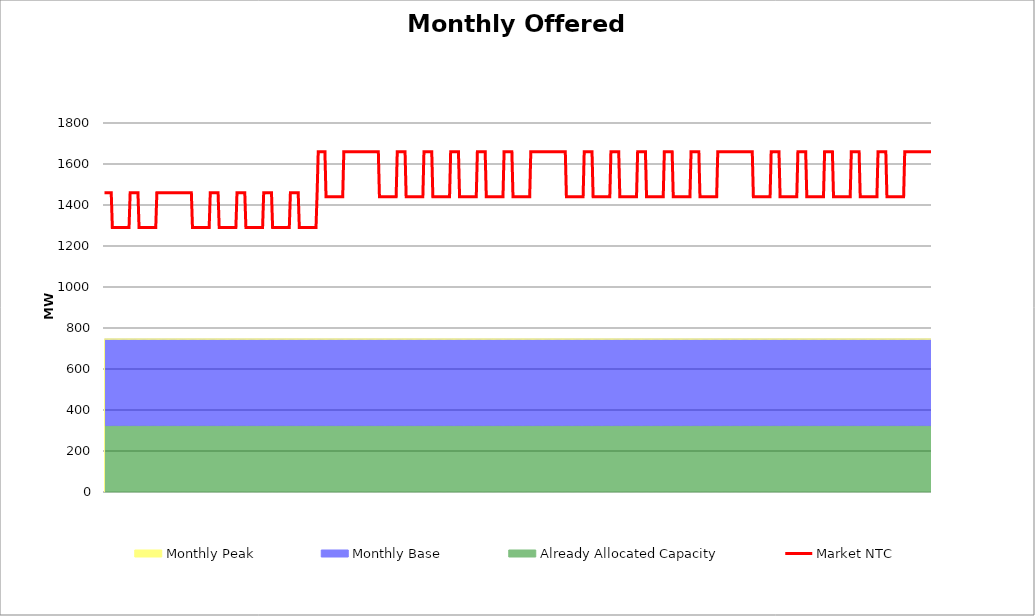
| Category | Market NTC |
|---|---|
| 0 | 1460 |
| 1 | 1460 |
| 2 | 1460 |
| 3 | 1460 |
| 4 | 1460 |
| 5 | 1460 |
| 6 | 1460 |
| 7 | 1290 |
| 8 | 1290 |
| 9 | 1290 |
| 10 | 1290 |
| 11 | 1290 |
| 12 | 1290 |
| 13 | 1290 |
| 14 | 1290 |
| 15 | 1290 |
| 16 | 1290 |
| 17 | 1290 |
| 18 | 1290 |
| 19 | 1290 |
| 20 | 1290 |
| 21 | 1290 |
| 22 | 1290 |
| 23 | 1460 |
| 24 | 1460 |
| 25 | 1460 |
| 26 | 1460 |
| 27 | 1460 |
| 28 | 1460 |
| 29 | 1460 |
| 30 | 1460 |
| 31 | 1290 |
| 32 | 1290 |
| 33 | 1290 |
| 34 | 1290 |
| 35 | 1290 |
| 36 | 1290 |
| 37 | 1290 |
| 38 | 1290 |
| 39 | 1290 |
| 40 | 1290 |
| 41 | 1290 |
| 42 | 1290 |
| 43 | 1290 |
| 44 | 1290 |
| 45 | 1290 |
| 46 | 1290 |
| 47 | 1460 |
| 48 | 1460 |
| 49 | 1460 |
| 50 | 1460 |
| 51 | 1460 |
| 52 | 1460 |
| 53 | 1460 |
| 54 | 1460 |
| 55 | 1460 |
| 56 | 1460 |
| 57 | 1460 |
| 58 | 1460 |
| 59 | 1460 |
| 60 | 1460 |
| 61 | 1460 |
| 62 | 1460 |
| 63 | 1460 |
| 64 | 1460 |
| 65 | 1460 |
| 66 | 1460 |
| 67 | 1460 |
| 68 | 1460 |
| 69 | 1460 |
| 70 | 1460 |
| 71 | 1460 |
| 72 | 1460 |
| 73 | 1460 |
| 74 | 1460 |
| 75 | 1460 |
| 76 | 1460 |
| 77 | 1460 |
| 78 | 1460 |
| 79 | 1290 |
| 80 | 1290 |
| 81 | 1290 |
| 82 | 1290 |
| 83 | 1290 |
| 84 | 1290 |
| 85 | 1290 |
| 86 | 1290 |
| 87 | 1290 |
| 88 | 1290 |
| 89 | 1290 |
| 90 | 1290 |
| 91 | 1290 |
| 92 | 1290 |
| 93 | 1290 |
| 94 | 1290 |
| 95 | 1460 |
| 96 | 1460 |
| 97 | 1460 |
| 98 | 1460 |
| 99 | 1460 |
| 100 | 1460 |
| 101 | 1460 |
| 102 | 1460 |
| 103 | 1290 |
| 104 | 1290 |
| 105 | 1290 |
| 106 | 1290 |
| 107 | 1290 |
| 108 | 1290 |
| 109 | 1290 |
| 110 | 1290 |
| 111 | 1290 |
| 112 | 1290 |
| 113 | 1290 |
| 114 | 1290 |
| 115 | 1290 |
| 116 | 1290 |
| 117 | 1290 |
| 118 | 1290 |
| 119 | 1460 |
| 120 | 1460 |
| 121 | 1460 |
| 122 | 1460 |
| 123 | 1460 |
| 124 | 1460 |
| 125 | 1460 |
| 126 | 1460 |
| 127 | 1290 |
| 128 | 1290 |
| 129 | 1290 |
| 130 | 1290 |
| 131 | 1290 |
| 132 | 1290 |
| 133 | 1290 |
| 134 | 1290 |
| 135 | 1290 |
| 136 | 1290 |
| 137 | 1290 |
| 138 | 1290 |
| 139 | 1290 |
| 140 | 1290 |
| 141 | 1290 |
| 142 | 1290 |
| 143 | 1460 |
| 144 | 1460 |
| 145 | 1460 |
| 146 | 1460 |
| 147 | 1460 |
| 148 | 1460 |
| 149 | 1460 |
| 150 | 1460 |
| 151 | 1290 |
| 152 | 1290 |
| 153 | 1290 |
| 154 | 1290 |
| 155 | 1290 |
| 156 | 1290 |
| 157 | 1290 |
| 158 | 1290 |
| 159 | 1290 |
| 160 | 1290 |
| 161 | 1290 |
| 162 | 1290 |
| 163 | 1290 |
| 164 | 1290 |
| 165 | 1290 |
| 166 | 1290 |
| 167 | 1460 |
| 168 | 1460 |
| 169 | 1460 |
| 170 | 1460 |
| 171 | 1460 |
| 172 | 1460 |
| 173 | 1460 |
| 174 | 1460 |
| 175 | 1290 |
| 176 | 1290 |
| 177 | 1290 |
| 178 | 1290 |
| 179 | 1290 |
| 180 | 1290 |
| 181 | 1290 |
| 182 | 1290 |
| 183 | 1290 |
| 184 | 1290 |
| 185 | 1290 |
| 186 | 1290 |
| 187 | 1290 |
| 188 | 1290 |
| 189 | 1290 |
| 190 | 1290 |
| 191 | 1460 |
| 192 | 1660 |
| 193 | 1660 |
| 194 | 1660 |
| 195 | 1660 |
| 196 | 1660 |
| 197 | 1660 |
| 198 | 1660 |
| 199 | 1440 |
| 200 | 1440 |
| 201 | 1440 |
| 202 | 1440 |
| 203 | 1440 |
| 204 | 1440 |
| 205 | 1440 |
| 206 | 1440 |
| 207 | 1440 |
| 208 | 1440 |
| 209 | 1440 |
| 210 | 1440 |
| 211 | 1440 |
| 212 | 1440 |
| 213 | 1440 |
| 214 | 1440 |
| 215 | 1660 |
| 216 | 1660 |
| 217 | 1660 |
| 218 | 1660 |
| 219 | 1660 |
| 220 | 1660 |
| 221 | 1660 |
| 222 | 1660 |
| 223 | 1660 |
| 224 | 1660 |
| 225 | 1660 |
| 226 | 1660 |
| 227 | 1660 |
| 228 | 1660 |
| 229 | 1660 |
| 230 | 1660 |
| 231 | 1660 |
| 232 | 1660 |
| 233 | 1660 |
| 234 | 1660 |
| 235 | 1660 |
| 236 | 1660 |
| 237 | 1660 |
| 238 | 1660 |
| 239 | 1660 |
| 240 | 1660 |
| 241 | 1660 |
| 242 | 1660 |
| 243 | 1660 |
| 244 | 1660 |
| 245 | 1660 |
| 246 | 1660 |
| 247 | 1440 |
| 248 | 1440 |
| 249 | 1440 |
| 250 | 1440 |
| 251 | 1440 |
| 252 | 1440 |
| 253 | 1440 |
| 254 | 1440 |
| 255 | 1440 |
| 256 | 1440 |
| 257 | 1440 |
| 258 | 1440 |
| 259 | 1440 |
| 260 | 1440 |
| 261 | 1440 |
| 262 | 1440 |
| 263 | 1660 |
| 264 | 1660 |
| 265 | 1660 |
| 266 | 1660 |
| 267 | 1660 |
| 268 | 1660 |
| 269 | 1660 |
| 270 | 1660 |
| 271 | 1440 |
| 272 | 1440 |
| 273 | 1440 |
| 274 | 1440 |
| 275 | 1440 |
| 276 | 1440 |
| 277 | 1440 |
| 278 | 1440 |
| 279 | 1440 |
| 280 | 1440 |
| 281 | 1440 |
| 282 | 1440 |
| 283 | 1440 |
| 284 | 1440 |
| 285 | 1440 |
| 286 | 1440 |
| 287 | 1660 |
| 288 | 1660 |
| 289 | 1660 |
| 290 | 1660 |
| 291 | 1660 |
| 292 | 1660 |
| 293 | 1660 |
| 294 | 1660 |
| 295 | 1440 |
| 296 | 1440 |
| 297 | 1440 |
| 298 | 1440 |
| 299 | 1440 |
| 300 | 1440 |
| 301 | 1440 |
| 302 | 1440 |
| 303 | 1440 |
| 304 | 1440 |
| 305 | 1440 |
| 306 | 1440 |
| 307 | 1440 |
| 308 | 1440 |
| 309 | 1440 |
| 310 | 1440 |
| 311 | 1660 |
| 312 | 1660 |
| 313 | 1660 |
| 314 | 1660 |
| 315 | 1660 |
| 316 | 1660 |
| 317 | 1660 |
| 318 | 1660 |
| 319 | 1440 |
| 320 | 1440 |
| 321 | 1440 |
| 322 | 1440 |
| 323 | 1440 |
| 324 | 1440 |
| 325 | 1440 |
| 326 | 1440 |
| 327 | 1440 |
| 328 | 1440 |
| 329 | 1440 |
| 330 | 1440 |
| 331 | 1440 |
| 332 | 1440 |
| 333 | 1440 |
| 334 | 1440 |
| 335 | 1660 |
| 336 | 1660 |
| 337 | 1660 |
| 338 | 1660 |
| 339 | 1660 |
| 340 | 1660 |
| 341 | 1660 |
| 342 | 1660 |
| 343 | 1440 |
| 344 | 1440 |
| 345 | 1440 |
| 346 | 1440 |
| 347 | 1440 |
| 348 | 1440 |
| 349 | 1440 |
| 350 | 1440 |
| 351 | 1440 |
| 352 | 1440 |
| 353 | 1440 |
| 354 | 1440 |
| 355 | 1440 |
| 356 | 1440 |
| 357 | 1440 |
| 358 | 1440 |
| 359 | 1660 |
| 360 | 1660 |
| 361 | 1660 |
| 362 | 1660 |
| 363 | 1660 |
| 364 | 1660 |
| 365 | 1660 |
| 366 | 1660 |
| 367 | 1440 |
| 368 | 1440 |
| 369 | 1440 |
| 370 | 1440 |
| 371 | 1440 |
| 372 | 1440 |
| 373 | 1440 |
| 374 | 1440 |
| 375 | 1440 |
| 376 | 1440 |
| 377 | 1440 |
| 378 | 1440 |
| 379 | 1440 |
| 380 | 1440 |
| 381 | 1440 |
| 382 | 1440 |
| 383 | 1660 |
| 384 | 1660 |
| 385 | 1660 |
| 386 | 1660 |
| 387 | 1660 |
| 388 | 1660 |
| 389 | 1660 |
| 390 | 1660 |
| 391 | 1660 |
| 392 | 1660 |
| 393 | 1660 |
| 394 | 1660 |
| 395 | 1660 |
| 396 | 1660 |
| 397 | 1660 |
| 398 | 1660 |
| 399 | 1660 |
| 400 | 1660 |
| 401 | 1660 |
| 402 | 1660 |
| 403 | 1660 |
| 404 | 1660 |
| 405 | 1660 |
| 406 | 1660 |
| 407 | 1660 |
| 408 | 1660 |
| 409 | 1660 |
| 410 | 1660 |
| 411 | 1660 |
| 412 | 1660 |
| 413 | 1660 |
| 414 | 1660 |
| 415 | 1440 |
| 416 | 1440 |
| 417 | 1440 |
| 418 | 1440 |
| 419 | 1440 |
| 420 | 1440 |
| 421 | 1440 |
| 422 | 1440 |
| 423 | 1440 |
| 424 | 1440 |
| 425 | 1440 |
| 426 | 1440 |
| 427 | 1440 |
| 428 | 1440 |
| 429 | 1440 |
| 430 | 1440 |
| 431 | 1660 |
| 432 | 1660 |
| 433 | 1660 |
| 434 | 1660 |
| 435 | 1660 |
| 436 | 1660 |
| 437 | 1660 |
| 438 | 1660 |
| 439 | 1440 |
| 440 | 1440 |
| 441 | 1440 |
| 442 | 1440 |
| 443 | 1440 |
| 444 | 1440 |
| 445 | 1440 |
| 446 | 1440 |
| 447 | 1440 |
| 448 | 1440 |
| 449 | 1440 |
| 450 | 1440 |
| 451 | 1440 |
| 452 | 1440 |
| 453 | 1440 |
| 454 | 1440 |
| 455 | 1660 |
| 456 | 1660 |
| 457 | 1660 |
| 458 | 1660 |
| 459 | 1660 |
| 460 | 1660 |
| 461 | 1660 |
| 462 | 1660 |
| 463 | 1440 |
| 464 | 1440 |
| 465 | 1440 |
| 466 | 1440 |
| 467 | 1440 |
| 468 | 1440 |
| 469 | 1440 |
| 470 | 1440 |
| 471 | 1440 |
| 472 | 1440 |
| 473 | 1440 |
| 474 | 1440 |
| 475 | 1440 |
| 476 | 1440 |
| 477 | 1440 |
| 478 | 1440 |
| 479 | 1660 |
| 480 | 1660 |
| 481 | 1660 |
| 482 | 1660 |
| 483 | 1660 |
| 484 | 1660 |
| 485 | 1660 |
| 486 | 1660 |
| 487 | 1440 |
| 488 | 1440 |
| 489 | 1440 |
| 490 | 1440 |
| 491 | 1440 |
| 492 | 1440 |
| 493 | 1440 |
| 494 | 1440 |
| 495 | 1440 |
| 496 | 1440 |
| 497 | 1440 |
| 498 | 1440 |
| 499 | 1440 |
| 500 | 1440 |
| 501 | 1440 |
| 502 | 1440 |
| 503 | 1660 |
| 504 | 1660 |
| 505 | 1660 |
| 506 | 1660 |
| 507 | 1660 |
| 508 | 1660 |
| 509 | 1660 |
| 510 | 1660 |
| 511 | 1440 |
| 512 | 1440 |
| 513 | 1440 |
| 514 | 1440 |
| 515 | 1440 |
| 516 | 1440 |
| 517 | 1440 |
| 518 | 1440 |
| 519 | 1440 |
| 520 | 1440 |
| 521 | 1440 |
| 522 | 1440 |
| 523 | 1440 |
| 524 | 1440 |
| 525 | 1440 |
| 526 | 1440 |
| 527 | 1660 |
| 528 | 1660 |
| 529 | 1660 |
| 530 | 1660 |
| 531 | 1660 |
| 532 | 1660 |
| 533 | 1660 |
| 534 | 1660 |
| 535 | 1440 |
| 536 | 1440 |
| 537 | 1440 |
| 538 | 1440 |
| 539 | 1440 |
| 540 | 1440 |
| 541 | 1440 |
| 542 | 1440 |
| 543 | 1440 |
| 544 | 1440 |
| 545 | 1440 |
| 546 | 1440 |
| 547 | 1440 |
| 548 | 1440 |
| 549 | 1440 |
| 550 | 1440 |
| 551 | 1660 |
| 552 | 1660 |
| 553 | 1660 |
| 554 | 1660 |
| 555 | 1660 |
| 556 | 1660 |
| 557 | 1660 |
| 558 | 1660 |
| 559 | 1660 |
| 560 | 1660 |
| 561 | 1660 |
| 562 | 1660 |
| 563 | 1660 |
| 564 | 1660 |
| 565 | 1660 |
| 566 | 1660 |
| 567 | 1660 |
| 568 | 1660 |
| 569 | 1660 |
| 570 | 1660 |
| 571 | 1660 |
| 572 | 1660 |
| 573 | 1660 |
| 574 | 1660 |
| 575 | 1660 |
| 576 | 1660 |
| 577 | 1660 |
| 578 | 1660 |
| 579 | 1660 |
| 580 | 1660 |
| 581 | 1660 |
| 582 | 1660 |
| 583 | 1440 |
| 584 | 1440 |
| 585 | 1440 |
| 586 | 1440 |
| 587 | 1440 |
| 588 | 1440 |
| 589 | 1440 |
| 590 | 1440 |
| 591 | 1440 |
| 592 | 1440 |
| 593 | 1440 |
| 594 | 1440 |
| 595 | 1440 |
| 596 | 1440 |
| 597 | 1440 |
| 598 | 1440 |
| 599 | 1660 |
| 600 | 1660 |
| 601 | 1660 |
| 602 | 1660 |
| 603 | 1660 |
| 604 | 1660 |
| 605 | 1660 |
| 606 | 1660 |
| 607 | 1440 |
| 608 | 1440 |
| 609 | 1440 |
| 610 | 1440 |
| 611 | 1440 |
| 612 | 1440 |
| 613 | 1440 |
| 614 | 1440 |
| 615 | 1440 |
| 616 | 1440 |
| 617 | 1440 |
| 618 | 1440 |
| 619 | 1440 |
| 620 | 1440 |
| 621 | 1440 |
| 622 | 1440 |
| 623 | 1660 |
| 624 | 1660 |
| 625 | 1660 |
| 626 | 1660 |
| 627 | 1660 |
| 628 | 1660 |
| 629 | 1660 |
| 630 | 1660 |
| 631 | 1440 |
| 632 | 1440 |
| 633 | 1440 |
| 634 | 1440 |
| 635 | 1440 |
| 636 | 1440 |
| 637 | 1440 |
| 638 | 1440 |
| 639 | 1440 |
| 640 | 1440 |
| 641 | 1440 |
| 642 | 1440 |
| 643 | 1440 |
| 644 | 1440 |
| 645 | 1440 |
| 646 | 1440 |
| 647 | 1660 |
| 648 | 1660 |
| 649 | 1660 |
| 650 | 1660 |
| 651 | 1660 |
| 652 | 1660 |
| 653 | 1660 |
| 654 | 1660 |
| 655 | 1440 |
| 656 | 1440 |
| 657 | 1440 |
| 658 | 1440 |
| 659 | 1440 |
| 660 | 1440 |
| 661 | 1440 |
| 662 | 1440 |
| 663 | 1440 |
| 664 | 1440 |
| 665 | 1440 |
| 666 | 1440 |
| 667 | 1440 |
| 668 | 1440 |
| 669 | 1440 |
| 670 | 1440 |
| 671 | 1660 |
| 672 | 1660 |
| 673 | 1660 |
| 674 | 1660 |
| 675 | 1660 |
| 676 | 1660 |
| 677 | 1660 |
| 678 | 1660 |
| 679 | 1440 |
| 680 | 1440 |
| 681 | 1440 |
| 682 | 1440 |
| 683 | 1440 |
| 684 | 1440 |
| 685 | 1440 |
| 686 | 1440 |
| 687 | 1440 |
| 688 | 1440 |
| 689 | 1440 |
| 690 | 1440 |
| 691 | 1440 |
| 692 | 1440 |
| 693 | 1440 |
| 694 | 1440 |
| 695 | 1660 |
| 696 | 1660 |
| 697 | 1660 |
| 698 | 1660 |
| 699 | 1660 |
| 700 | 1660 |
| 701 | 1660 |
| 702 | 1660 |
| 703 | 1440 |
| 704 | 1440 |
| 705 | 1440 |
| 706 | 1440 |
| 707 | 1440 |
| 708 | 1440 |
| 709 | 1440 |
| 710 | 1440 |
| 711 | 1440 |
| 712 | 1440 |
| 713 | 1440 |
| 714 | 1440 |
| 715 | 1440 |
| 716 | 1440 |
| 717 | 1440 |
| 718 | 1440 |
| 719 | 1660 |
| 720 | 1660 |
| 721 | 1660 |
| 722 | 1660 |
| 723 | 1660 |
| 724 | 1660 |
| 725 | 1660 |
| 726 | 1660 |
| 727 | 1660 |
| 728 | 1660 |
| 729 | 1660 |
| 730 | 1660 |
| 731 | 1660 |
| 732 | 1660 |
| 733 | 1660 |
| 734 | 1660 |
| 735 | 1660 |
| 736 | 1660 |
| 737 | 1660 |
| 738 | 1660 |
| 739 | 1660 |
| 740 | 1660 |
| 741 | 1660 |
| 742 | 1660 |
| 743 | 1660 |